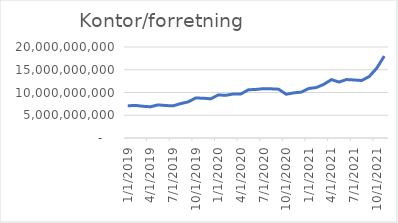
| Category | Kontor/forretning |
|---|---|
| 1/1/19 | 7071034166.667 |
| 2/1/19 | 7171334166.667 |
| 3/1/19 | 6972876250 |
| 4/1/19 | 6858830833.333 |
| 5/1/19 | 7274653333.333 |
| 6/1/19 | 7143676666.667 |
| 7/1/19 | 7057480833.333 |
| 8/1/19 | 7552567500 |
| 9/1/19 | 7932506666.667 |
| 10/1/19 | 8788923333.333 |
| 11/1/19 | 8746623333.333 |
| 12/1/19 | 8618469166.667 |
| 1/1/20 | 9456527500 |
| 2/1/20 | 9382190000 |
| 3/1/20 | 9678310833.333 |
| 4/1/20 | 9685648333.333 |
| 5/1/20 | 10600495000 |
| 6/1/20 | 10671909166.667 |
| 7/1/20 | 10849667500 |
| 8/1/20 | 10809921666.667 |
| 9/1/20 | 10729039166.667 |
| 10/1/20 | 9617255833.333 |
| 11/1/20 | 9919735000 |
| 12/1/20 | 10084047500 |
| 1/1/21 | 10882585000 |
| 2/1/21 | 11088030833.333 |
| 3/1/21 | 11804289166.667 |
| 4/1/21 | 12833985000 |
| 5/1/21 | 12298663333.333 |
| 6/1/21 | 12849384166.667 |
| 7/1/21 | 12752400833.333 |
| 8/1/21 | 12635296666.667 |
| 9/1/21 | 13489779166.667 |
| 10/1/21 | 15331670833.333 |
| 11/1/21 | 17999954166.667 |